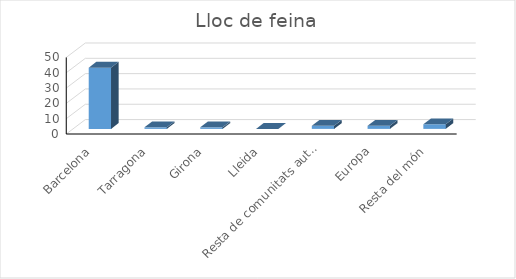
| Category | Series 0 |
|---|---|
| Barcelona | 40 |
| Tarragona | 1 |
| Girona | 1 |
| Lleida | 0 |
| Resta de comunitats autònomes | 2 |
| Europa | 2 |
| Resta del món | 3 |